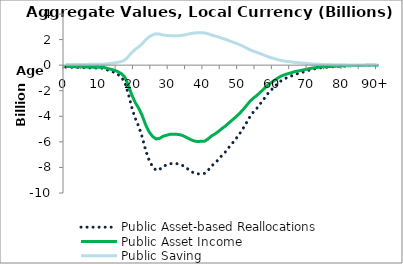
| Category | Public Asset-based Reallocations | Public Asset Income | Public Saving |
|---|---|---|---|
| 0 | -152.953 | -107.406 | 45.547 |
|  | -161.435 | -113.363 | 48.073 |
| 2 | -168.386 | -118.243 | 50.142 |
| 3 | -176.44 | -123.899 | 52.541 |
| 4 | -183.617 | -128.939 | 54.678 |
| 5 | -190.659 | -133.884 | 56.775 |
| 6 | -198.529 | -139.41 | 59.118 |
| 7 | -213.535 | -149.948 | 63.587 |
| 8 | -223.544 | -156.977 | 66.568 |
| 9 | -226.698 | -159.192 | 67.507 |
| 10 | -231.958 | -162.885 | 69.073 |
| 11 | -242.172 | -170.058 | 72.115 |
| 12 | -377.757 | -265.267 | 112.489 |
| 13 | -460.508 | -323.377 | 137.131 |
| 14 | -568 | -398.859 | 169.14 |
| 15 | -720.463 | -505.922 | 214.541 |
| 16 | -946.429 | -664.599 | 281.83 |
| 17 | -1326.304 | -931.354 | 394.95 |
| 18 | -2212.925 | -1553.954 | 658.97 |
| 19 | -3290.955 | -2310.966 | 979.989 |
| 20 | -4148.984 | -2913.489 | 1235.495 |
| 21 | -4784.221 | -3359.563 | 1424.657 |
| 22 | -5603.106 | -3934.599 | 1668.507 |
| 23 | -6635.536 | -4659.589 | 1975.947 |
| 24 | -7429.8 | -5217.335 | 2212.465 |
| 25 | -7934.937 | -5572.051 | 2362.886 |
| 26 | -8221.321 | -5773.155 | 2448.166 |
| 27 | -8168.743 | -5736.234 | 2432.509 |
| 28 | -7926.837 | -5566.364 | 2360.474 |
| 29 | -7806.936 | -5482.167 | 2324.769 |
| 30 | -7712.112 | -5415.58 | 2296.532 |
| 31 | -7685.043 | -5396.571 | 2288.472 |
| 32 | -7705.883 | -5411.206 | 2294.677 |
| 33 | -7755.51 | -5446.054 | 2309.455 |
| 34 | -7897.433 | -5545.716 | 2351.718 |
| 35 | -8091.512 | -5682.001 | 2409.511 |
| 36 | -8297.768 | -5826.838 | 2470.93 |
| 37 | -8447.544 | -5932.013 | 2515.531 |
| 38 | -8507.555 | -5974.153 | 2533.401 |
| 39 | -8480.939 | -5955.463 | 2525.476 |
| 40 | -8468.236 | -5946.543 | 2521.693 |
| 41 | -8218.021 | -5770.838 | 2447.183 |
| 42 | -7881.101 | -5534.247 | 2346.854 |
| 43 | -7655.534 | -5375.85 | 2279.684 |
| 44 | -7378.019 | -5180.974 | 2197.045 |
| 45 | -7052.555 | -4952.427 | 2100.128 |
| 46 | -6781.308 | -4761.953 | 2019.355 |
| 47 | -6426.645 | -4512.902 | 1913.743 |
| 48 | -6102.312 | -4285.15 | 1817.162 |
| 49 | -5763.285 | -4047.079 | 1716.206 |
| 50 | -5400.988 | -3792.668 | 1608.32 |
| 51 | -4984.134 | -3499.946 | 1484.188 |
| 52 | -4526.149 | -3178.341 | 1347.808 |
| 53 | -4053.446 | -2846.401 | 1207.045 |
| 54 | -3682.441 | -2585.874 | 1096.567 |
| 55 | -3392.104 | -2381.995 | 1010.109 |
| 56 | -3022.945 | -2122.765 | 900.18 |
| 57 | -2675.3 | -1878.642 | 796.657 |
| 58 | -2289.203 | -1607.518 | 681.685 |
| 59 | -1985.239 | -1394.069 | 591.169 |
| 60 | -1721.402 | -1208.798 | 512.603 |
| 61 | -1449.378 | -1017.779 | 431.6 |
| 62 | -1229.116 | -863.106 | 366.009 |
| 63 | -1069.802 | -751.233 | 318.568 |
| 64 | -950.654 | -667.566 | 283.088 |
| 65 | -844.217 | -592.824 | 251.393 |
| 66 | -719.672 | -505.366 | 214.306 |
| 67 | -645.163 | -453.045 | 192.118 |
| 68 | -572.432 | -401.972 | 170.46 |
| 69 | -487.521 | -342.345 | 145.175 |
| 70 | -401.746 | -282.113 | 119.633 |
| 71 | -321.066 | -225.459 | 95.608 |
| 72 | -272.937 | -191.661 | 81.276 |
| 73 | -224.42 | -157.591 | 66.828 |
| 74 | -189.739 | -133.238 | 56.501 |
| 75 | -167.604 | -117.695 | 49.91 |
| 76 | -146.699 | -103.015 | 43.685 |
| 77 | -124.295 | -87.282 | 37.013 |
| 78 | -106.792 | -74.991 | 31.801 |
| 79 | -89.367 | -62.755 | 26.612 |
| 80 | -77.091 | -54.134 | 22.956 |
| 81 | -65.823 | -46.222 | 19.601 |
| 82 | -55.483 | -38.961 | 16.522 |
| 83 | -44.753 | -31.427 | 13.327 |
| 84 | -35.296 | -24.785 | 10.51 |
| 85 | -30.671 | -21.537 | 9.133 |
| 86 | -26.89 | -18.882 | 8.007 |
| 87 | -22.616 | -15.881 | 6.735 |
| 88 | -18.703 | -13.133 | 5.569 |
| 89 | -14.927 | -10.482 | 4.445 |
| 90+ | -59.256 | -41.61 | 17.645 |